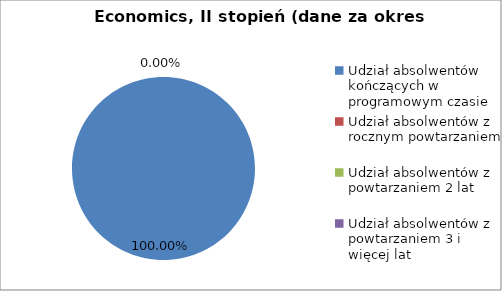
| Category | Series 0 |
|---|---|
| Udział absolwentów kończących w programowym czasie | 100 |
| Udział absolwentów z rocznym powtarzaniem | 0 |
| Udział absolwentów z powtarzaniem 2 lat | 0 |
| Udział absolwentów z powtarzaniem 3 i więcej lat | 0 |